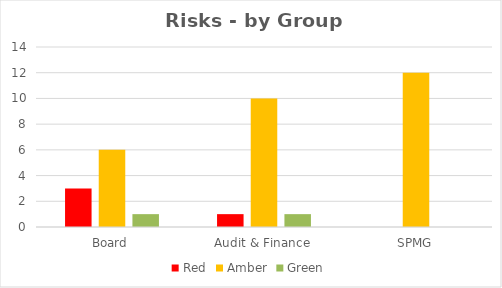
| Category | Red | Amber | Green |
|---|---|---|---|
| Board | 3 | 6 | 1 |
| Audit & Finance | 1 | 10 | 1 |
| SPMG | 0 | 12 | 0 |